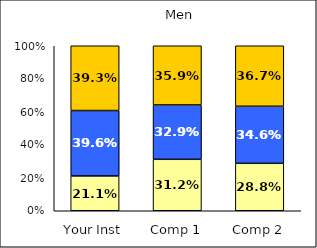
| Category | Low Academic Self-Concept | Average Academic Self-Concept | High Academic Self-Concept |
|---|---|---|---|
| Your Inst | 0.211 | 0.396 | 0.393 |
| Comp 1 | 0.312 | 0.329 | 0.359 |
| Comp 2 | 0.288 | 0.346 | 0.367 |